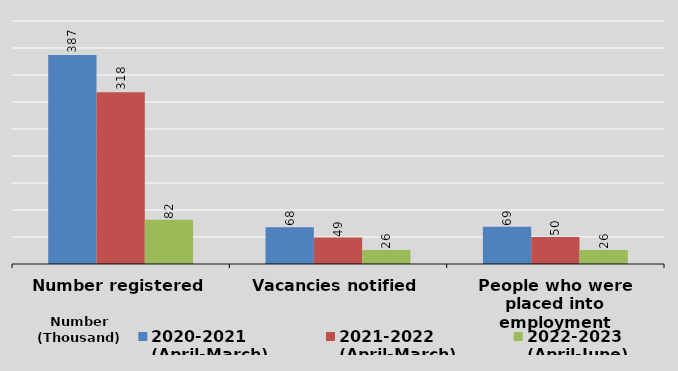
| Category | 2020-2021
(April-March) | 2021-2022
(April-March) | 2022-2023
(April-June) |
|---|---|---|---|
| Number registered | 387 | 318 | 82 |
| Vacancies notified | 68 | 49 | 26 |
| People who were placed into employment | 69 | 50 | 26 |